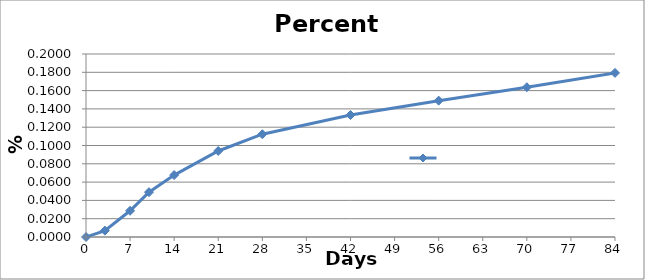
| Category | Series 0 |
|---|---|
| 0.0 | 0 |
| 3.0 | 0.007 |
| 7.0 | 0.029 |
| 10.0 | 0.049 |
| 14.0 | 0.068 |
| 21.0 | 0.094 |
| 28.0 | 0.112 |
| 42.0 | 0.133 |
| 56.0 | 0.149 |
| 70.0 | 0.164 |
| 84.0 | 0.179 |